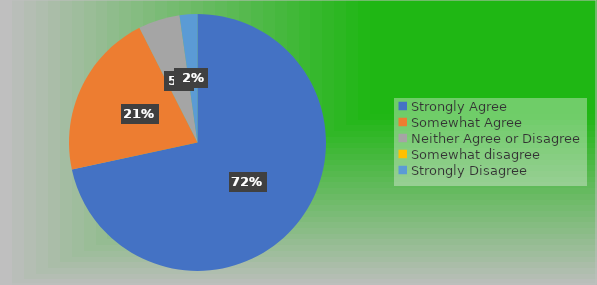
| Category | Series 0 |
|---|---|
| Strongly Agree | 96 |
| Somewhat Agree | 28 |
| Neither Agree or Disagree | 7 |
| Somewhat disagree | 0 |
| Strongly Disagree | 3 |